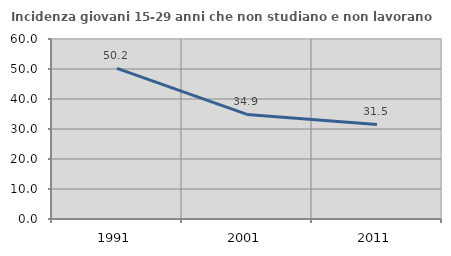
| Category | Incidenza giovani 15-29 anni che non studiano e non lavorano  |
|---|---|
| 1991.0 | 50.218 |
| 2001.0 | 34.857 |
| 2011.0 | 31.529 |